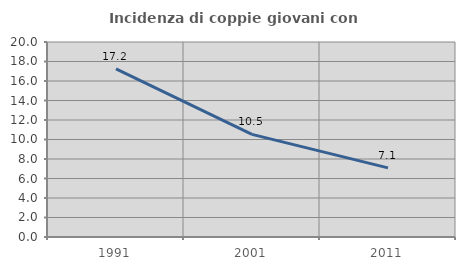
| Category | Incidenza di coppie giovani con figli |
|---|---|
| 1991.0 | 17.234 |
| 2001.0 | 10.523 |
| 2011.0 | 7.09 |